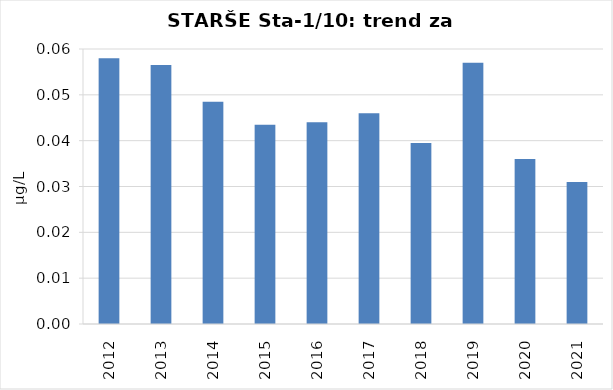
| Category | Vsota |
|---|---|
| 2012 | 0.058 |
| 2013 | 0.056 |
| 2014 | 0.048 |
| 2015 | 0.044 |
| 2016 | 0.044 |
| 2017 | 0.046 |
| 2018 | 0.04 |
| 2019 | 0.057 |
| 2020 | 0.036 |
| 2021 | 0.031 |